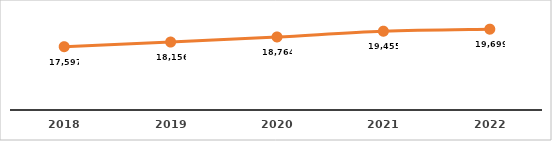
| Category | COSTO POR ALUMNO (%) |
|---|---|
| 2018.0 | 17596.601 |
| 2019.0 | 18155.932 |
| 2020.0 | 18764.386 |
| 2021.0 | 19454.777 |
| 2022.0 | 19699.359 |